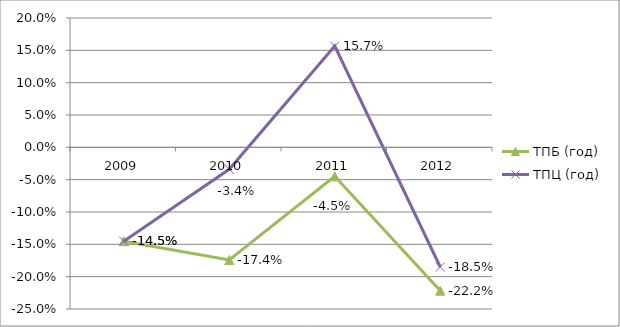
| Category | ТПБ (год) | ТПЦ (год) |
|---|---|---|
| 2009.0 | -0.145 | -0.145 |
| 2010.0 | -0.174 | -0.034 |
| 2011.0 | -0.045 | 0.157 |
| 2012.0 | -0.222 | -0.185 |